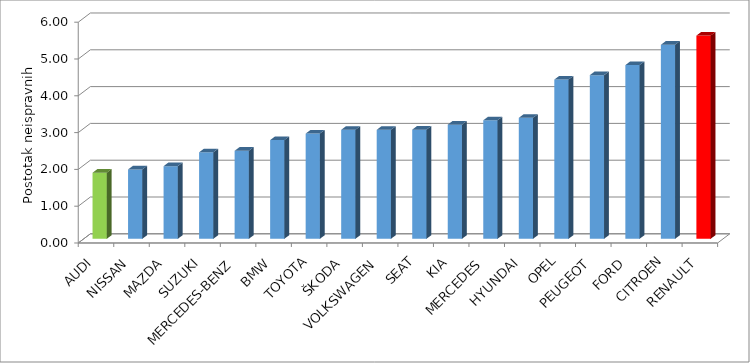
| Category | Series 4 |
|---|---|
| AUDI | 1.796 |
| NISSAN | 1.884 |
| MAZDA | 1.975 |
| SUZUKI | 2.351 |
| MERCEDES-BENZ | 2.392 |
| BMW | 2.683 |
| TOYOTA | 2.86 |
| ŠKODA | 2.962 |
| VOLKSWAGEN | 2.962 |
| SEAT | 2.967 |
| KIA | 3.103 |
| MERCEDES | 3.221 |
| HYUNDAI | 3.287 |
| OPEL | 4.327 |
| PEUGEOT | 4.449 |
| FORD | 4.721 |
| CITROEN | 5.273 |
| RENAULT | 5.522 |